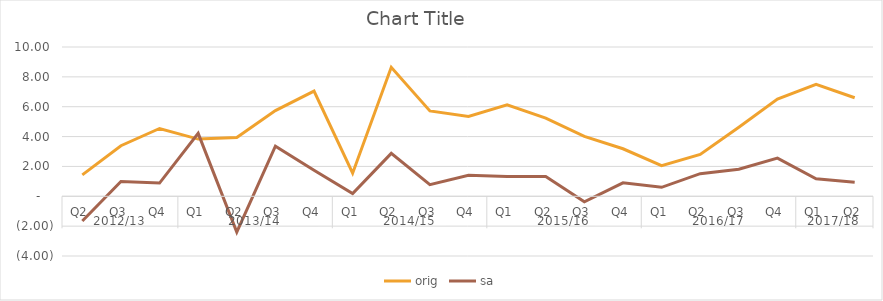
| Category | orig | sa |
|---|---|---|
| 0 | 1.435 | -1.653 |
| 1 | 3.387 | 0.99 |
| 2 | 4.541 | 0.884 |
| 3 | 3.83 | 4.214 |
| 4 | 3.941 | -2.4 |
| 5 | 5.741 | 3.361 |
| 6 | 7.047 | 1.744 |
| 7 | 1.546 | 0.186 |
| 8 | 8.637 | 2.876 |
| 9 | 5.716 | 0.777 |
| 10 | 5.347 | 1.407 |
| 11 | 6.129 | 1.328 |
| 12 | 5.231 | 1.327 |
| 13 | 4.009 | -0.374 |
| 14 | 3.183 | 0.903 |
| 15 | 2.056 | 0.599 |
| 16 | 2.808 | 1.516 |
| 17 | 4.63 | 1.813 |
| 18 | 6.506 | 2.56 |
| 19 | 7.492 | 1.174 |
| 20 | 6.603 | 0.946 |